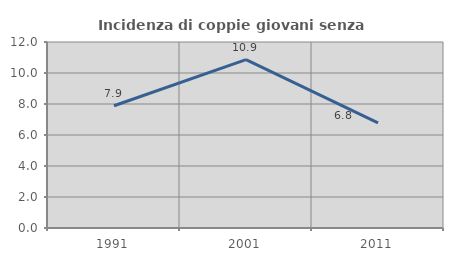
| Category | Incidenza di coppie giovani senza figli |
|---|---|
| 1991.0 | 7.886 |
| 2001.0 | 10.859 |
| 2011.0 | 6.783 |